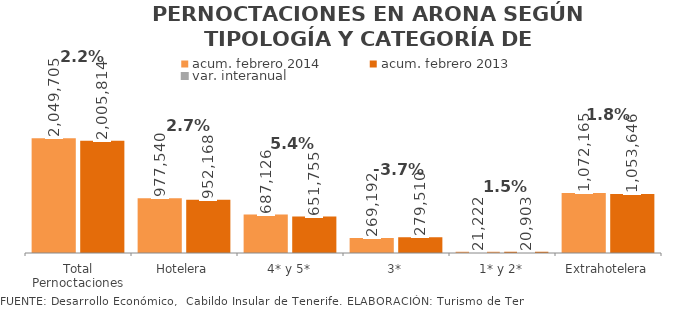
| Category | acum. febrero 2014 | acum. febrero 2013 |
|---|---|---|
| Total Pernoctaciones | 2049705 | 2005814 |
| Hotelera | 977540 | 952168 |
| 4* y 5* | 687126 | 651755 |
| 3* | 269192 | 279510 |
| 1* y 2* | 21222 | 20903 |
| Extrahotelera | 1072165 | 1053646 |